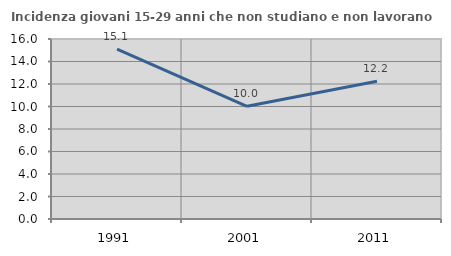
| Category | Incidenza giovani 15-29 anni che non studiano e non lavorano  |
|---|---|
| 1991.0 | 15.107 |
| 2001.0 | 10.015 |
| 2011.0 | 12.245 |